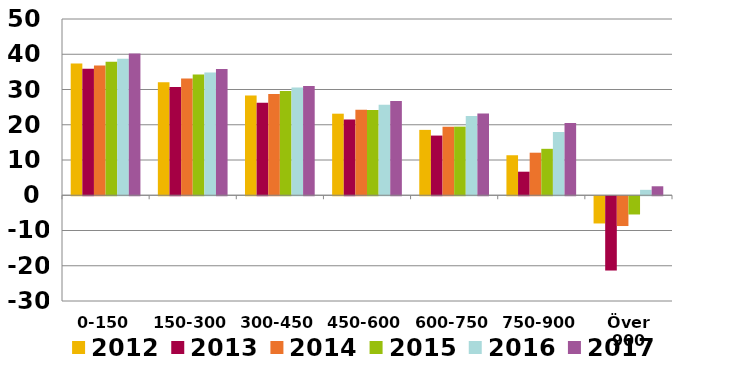
| Category | 2012 | 2013 | 2014 | 2015 | 2016 | 2017 |
|---|---|---|---|---|---|---|
| 0-150 | 37.343 | 35.864 | 36.794 | 37.84 | 38.756 | 40.221 |
| 150-300 | 32.04 | 30.686 | 33.119 | 34.226 | 34.822 | 35.781 |
| 300-450 | 28.27 | 26.259 | 28.741 | 29.549 | 30.571 | 30.988 |
| 450-600 | 23.138 | 21.517 | 24.277 | 24.168 | 25.64 | 26.732 |
| 600-750 | 18.543 | 16.929 | 19.4 | 19.466 | 22.484 | 23.211 |
| 750-900 | 11.348 | 6.68 | 12.071 | 13.172 | 17.938 | 20.518 |
| Över 900 | -7.72 | -21.07 | -8.45 | -5.172 | 1.538 | 2.546 |